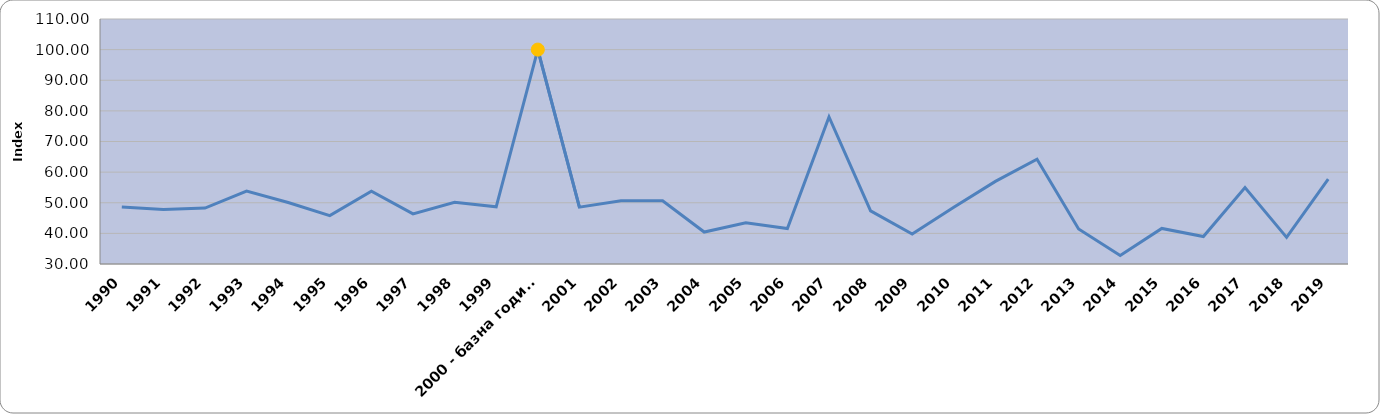
| Category | Вкупно (нето емисии) |
|---|---|
| 1990 | 48.644 |
| 1991 | 47.817 |
| 1992 | 48.247 |
| 1993 | 53.822 |
| 1994 | 50.092 |
| 1995 | 45.786 |
| 1996 | 53.755 |
| 1997 | 46.384 |
| 1998 | 50.141 |
| 1999 | 48.667 |
| 2000 - базна година | 100 |
| 2001 | 48.575 |
| 2002 | 50.678 |
| 2003 | 50.665 |
| 2004 | 40.443 |
| 2005 | 43.496 |
| 2006 | 41.578 |
| 2007 | 78.004 |
| 2008 | 47.356 |
| 2009 | 39.804 |
| 2010 | 48.555 |
| 2011 | 56.977 |
| 2012 | 64.233 |
| 2013 | 41.436 |
| 2014 | 32.802 |
| 2015 | 41.617 |
| 2016 | 38.95 |
| 2017 | 54.945 |
| 2018 | 38.682 |
| 2019 | 57.739 |